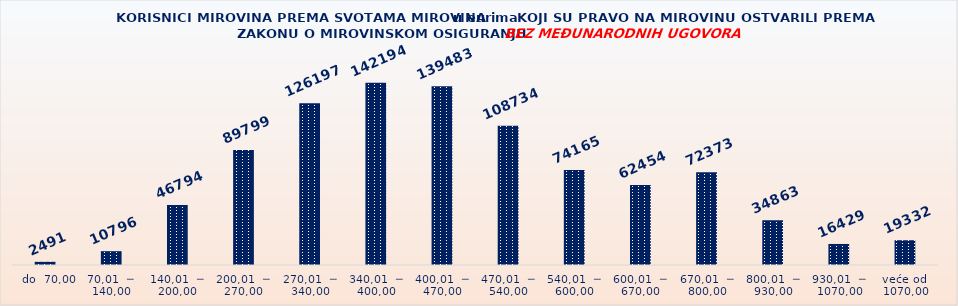
| Category | KORISNICI MIROVINA PREMA VRSTAMA I SVOTAMA MIROVINA KOJI SU PRAVO NA MIROVINU OSTVARILI PREMA ZAKONU O MIROVINSKOM OSIGURANJU 
BEZ MEĐUNARODNIH UGOVORA |
|---|---|
|   do  70,00 | 2491 |
| 70,01  ─  140,00 | 10796 |
| 140,01  ─  200,00 | 46794 |
| 200,01  ─  270,00 | 89799 |
| 270,01  ─  340,00 | 126197 |
| 340,01  ─  400,00 | 142194 |
| 400,01  ─  470,00 | 139483 |
| 470,01  ─  540,00 | 108734 |
| 540,01  ─  600,00 | 74165 |
| 600,01  ─  670,00 | 62454 |
| 670,01  ─  800,00 | 72373 |
| 800,01  ─  930,00 | 34863 |
| 930,01  ─  1070,00 | 16429 |
| veće od  1070,00 | 19332 |